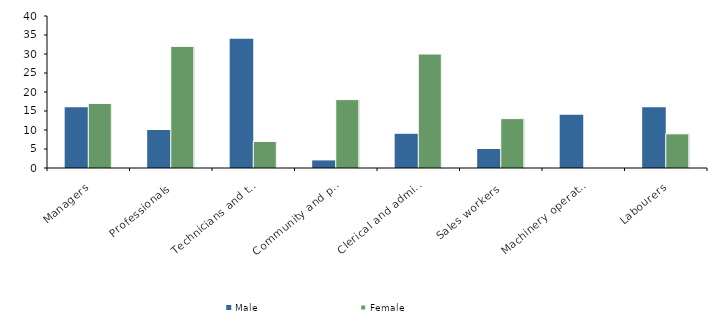
| Category | Male | Female |
|---|---|---|
| Managers | 16 | 17 |
| Professionals | 10 | 32 |
| Technicians and trades workers | 34 | 7 |
| Community and personal service workers | 2 | 18 |
| Clerical and administrative workers | 9 | 30 |
| Sales workers | 5 | 13 |
| Machinery operators and drivers | 14 | 0 |
| Labourers | 16 | 9 |